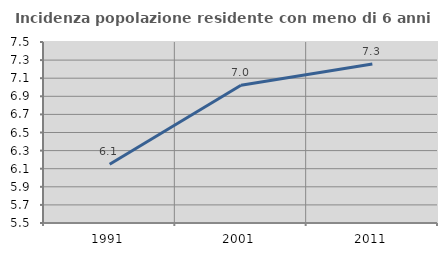
| Category | Incidenza popolazione residente con meno di 6 anni |
|---|---|
| 1991.0 | 6.148 |
| 2001.0 | 7.022 |
| 2011.0 | 7.256 |